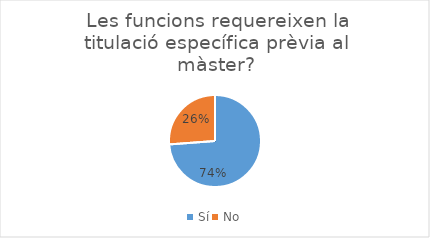
| Category | Series 0 |
|---|---|
| Sí | 31 |
| No | 11 |